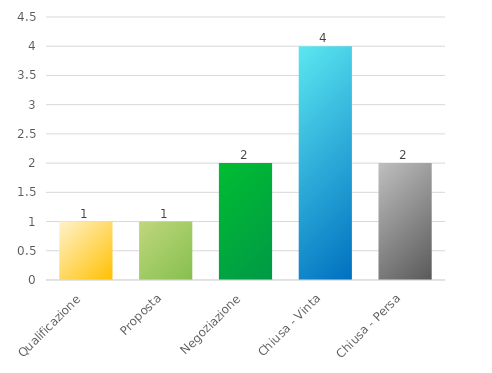
| Category | Series 0 |
|---|---|
| Qualificazione | 1 |
| Proposta | 1 |
| Negoziazione | 2 |
| Chiusa - Vinta | 4 |
| Chiusa - Persa | 2 |